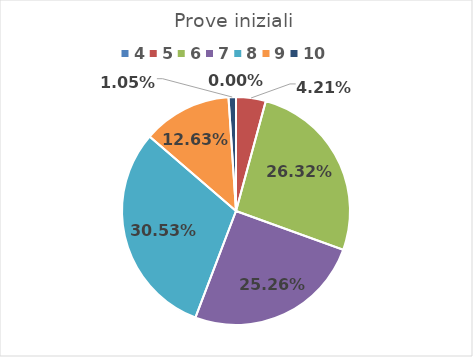
| Category | Series 0 |
|---|---|
| 4.0 | 0 |
| 5.0 | 0.042 |
| 6.0 | 0.263 |
| 7.0 | 0.253 |
| 8.0 | 0.305 |
| 9.0 | 0.126 |
| 10.0 | 0.011 |